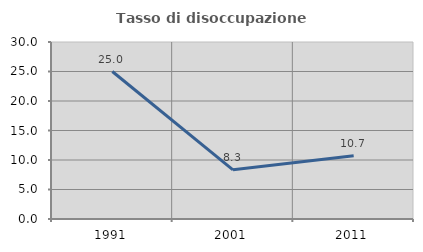
| Category | Tasso di disoccupazione giovanile  |
|---|---|
| 1991.0 | 25 |
| 2001.0 | 8.333 |
| 2011.0 | 10.714 |